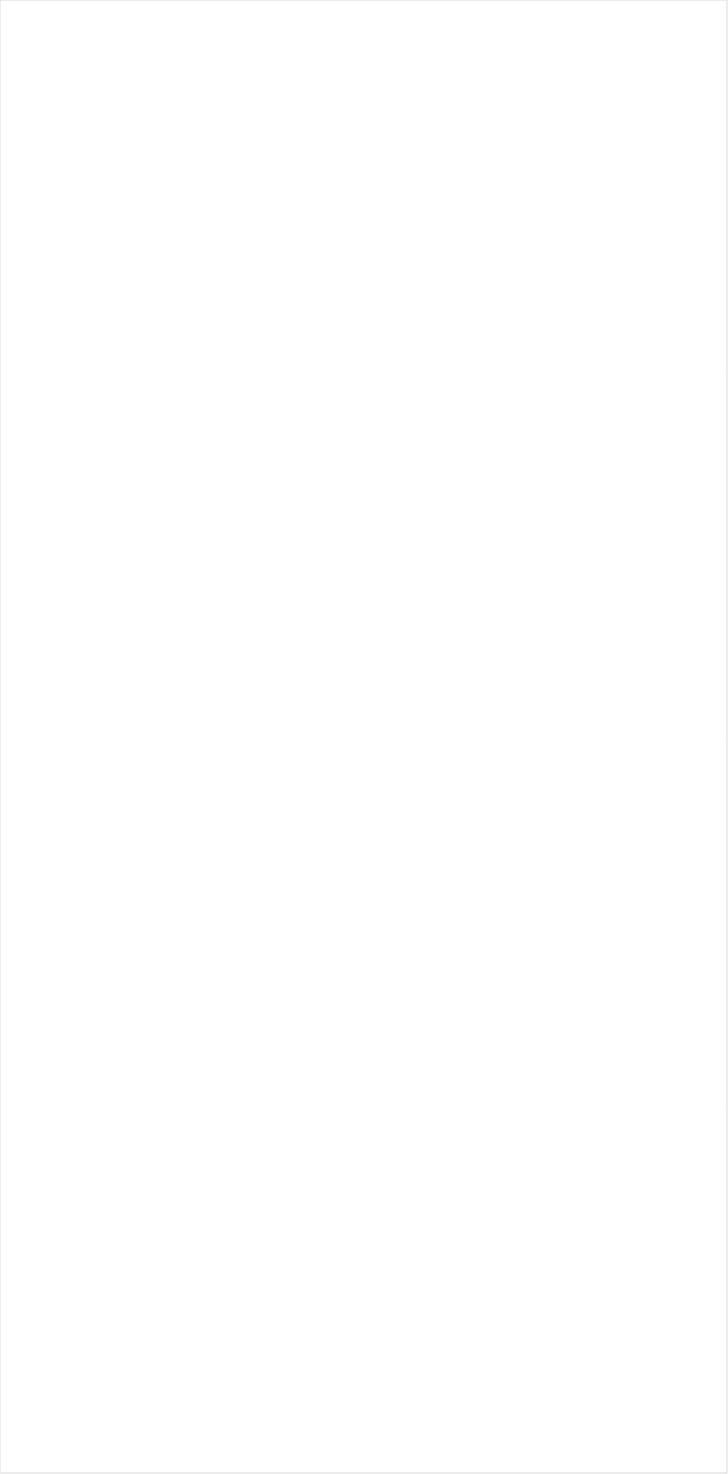
| Category | Total |
|---|---|
| Galavision | -0.839 |
| UniMas | -0.817 |
| Telemundo | -0.81 |
| Univision | -0.798 |
| NBC Universo | -0.762 |
| TUDN | -0.737 |
| ESPN Deportes | -0.669 |
| Cartoon Network | -0.444 |
| Discovery Life Channel | -0.281 |
| Travel | -0.254 |
| Nick Toons | -0.249 |
| Lifetime Movies | -0.242 |
| Adult Swim | -0.238 |
| Nick | -0.217 |
| Logo | -0.212 |
| Disney Channel | -0.189 |
| Investigation Discovery | -0.187 |
| Disney XD | -0.182 |
| TLC | -0.162 |
| UP TV | -0.16 |
| Hallmark Movies & Mysteries | -0.147 |
| OXYGEN | -0.146 |
| WE TV | -0.131 |
| Nick Jr. | -0.126 |
| ION | -0.11 |
| Oprah Winfrey Network | -0.103 |
| Headline News | -0.102 |
| VH1 | -0.102 |
| Lifetime | -0.101 |
| INSP | -0.099 |
| Hallmark | -0.085 |
| BET | -0.084 |
| Science Channel | -0.081 |
| Nick@Nite | -0.076 |
| FXDEP | -0.074 |
| CW | -0.061 |
| Disney Junior US | -0.058 |
| Universal Kids | -0.036 |
| Animal Planet | -0.013 |
| MTV | -0.01 |
| Motor Trend Network | -0.007 |
| National Geographic Wild | 0.001 |
| MTV2 | 0.007 |
| A&E | 0.01 |
| BET Her | 0.016 |
| E! | 0.021 |
| Discovery Channel | 0.025 |
| Discovery Family Channel | 0.026 |
| History Channel | 0.039 |
| Freeform | 0.04 |
| TV ONE | 0.041 |
| CMTV | 0.044 |
| Great American Country | 0.044 |
| Paramount Network | 0.054 |
| Reelz Channel | 0.057 |
| MyNetworkTV | 0.059 |
| TV LAND | 0.069 |
| BRAVO | 0.071 |
| FYI | 0.074 |
| SYFY | 0.077 |
| FOX | 0.079 |
| American Heroes Channel | 0.09 |
| POP | 0.094 |
| National Geographic | 0.096 |
| Ovation | 0.103 |
| WGN America | 0.103 |
| RFD TV | 0.113 |
| Fox Business | 0.117 |
| USA Network | 0.122 |
| HGTV | 0.132 |
| Weather Channel | 0.138 |
| FX | 0.139 |
| FX Movie Channel | 0.144 |
| ABC | 0.145 |
| Smithsonian | 0.145 |
| MSNBC | 0.145 |
| TBS | 0.155 |
| NBC | 0.18 |
| Food Network | 0.181 |
| Game Show | 0.184 |
| AMC | 0.187 |
| Fox News | 0.2 |
| TNT | 0.201 |
| truTV | 0.205 |
| SundanceTV | 0.211 |
| Destination America | 0.226 |
| Independent Film (IFC) | 0.239 |
| PBS | 0.241 |
| CNN | 0.246 |
| CBS | 0.25 |
| Viceland | 0.256 |
| Outdoor Channel | 0.261 |
| DIY | 0.268 |
| BBC America | 0.272 |
| Olympic Channel | 0.275 |
| Cooking Channel | 0.29 |
| Bloomberg HD | 0.292 |
| CNBC | 0.316 |
| The Sportsman Channel | 0.317 |
| Tennis Channel | 0.343 |
| Comedy Central | 0.382 |
| NHL | 0.615 |
| NBC Sports | 0.693 |
| Fox Sports 1 | 0.706 |
| NFL Network | 0.822 |
| CBS Sports | 0.858 |
| Golf | 0.877 |
| ESPN | 0.937 |
| MLB Network | 1.003 |
| ESPNEWS | 1.02 |
| ESPN2 | 1.022 |
| PAC-12 Network | 1.073 |
| NBA TV | 1.105 |
| ESPNU | 1.425 |
| Big Ten Network | 1.743 |